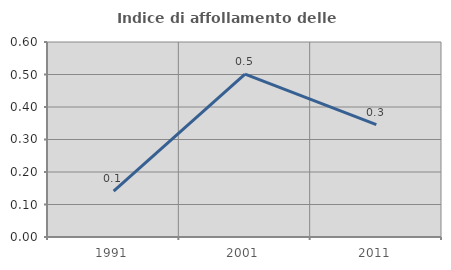
| Category | Indice di affollamento delle abitazioni  |
|---|---|
| 1991.0 | 0.141 |
| 2001.0 | 0.501 |
| 2011.0 | 0.346 |